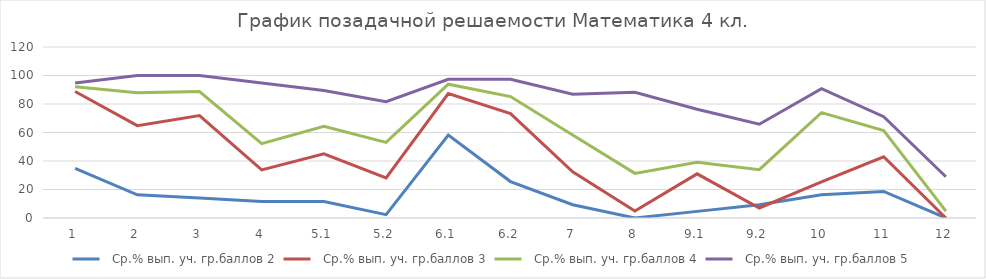
| Category |   Ср.% вып. уч. гр.баллов 2 |   Ср.% вып. уч. гр.баллов 3 |   Ср.% вып. уч. гр.баллов 4 |   Ср.% вып. уч. гр.баллов 5 |
|---|---|---|---|---|
| 1.0 | 34.88 | 88.73 | 92.17 | 94.74 |
| 2.0 | 16.28 | 64.79 | 87.83 | 100 |
| 3.0 | 13.95 | 71.83 | 88.7 | 100 |
| 4.0 | 11.63 | 33.8 | 52.17 | 94.74 |
| 5.1 | 11.63 | 45.07 | 64.35 | 89.47 |
| 5.2 | 2.33 | 28.17 | 53.04 | 81.58 |
| 6.1 | 58.14 | 87.32 | 93.91 | 97.37 |
| 6.2 | 25.58 | 73.24 | 85.22 | 97.37 |
| 7.0 | 9.3 | 32.39 | 58.26 | 86.84 |
| 8.0 | 0 | 4.93 | 31.3 | 88.16 |
| 9.1 | 4.65 | 30.99 | 39.13 | 76.32 |
| 9.2 | 9.3 | 7.04 | 33.91 | 65.79 |
| 10.0 | 16.28 | 25.35 | 73.91 | 90.79 |
| 11.0 | 18.6 | 42.96 | 61.3 | 71.05 |
| 12.0 | 0 | 0 | 4.78 | 28.95 |